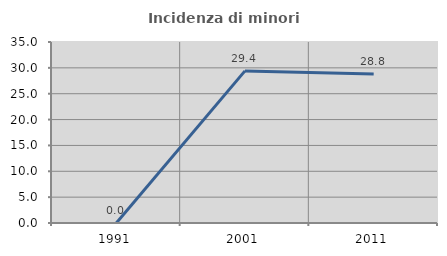
| Category | Incidenza di minori stranieri |
|---|---|
| 1991.0 | 0 |
| 2001.0 | 29.412 |
| 2011.0 | 28.829 |